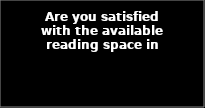
| Category | Series 0 |
|---|---|
| NOT SATISFIED | 0.028 |
| PARTLY SATISFIED | 0.119 |
| SATISFIED | 0.853 |